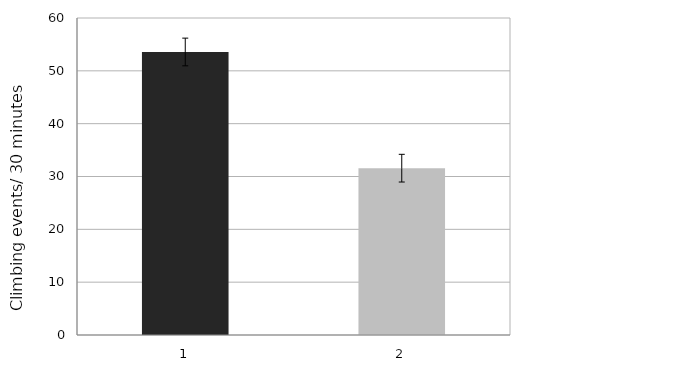
| Category | Series 0 |
|---|---|
| 0 | 53.569 |
| 1 | 31.576 |